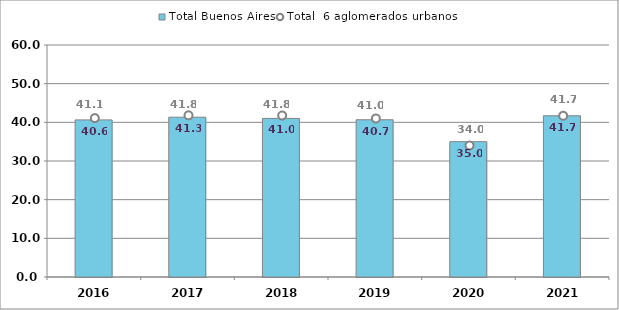
| Category | Total Buenos Aires |
|---|---|
| 2016.0 | 40.63 |
| 2017.0 | 41.33 |
| 2018.0 | 41.01 |
| 2019.0 | 40.67 |
| 2020.0 | 35 |
| 2021.0 | 41.7 |